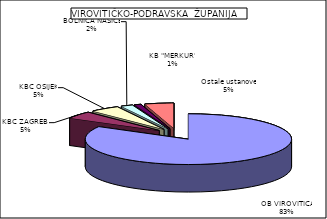
| Category | Series 0 |
|---|---|
| OB VIROVITICA | 83.245 |
| KBC ZAGREB  | 4.649 |
| KBC OSIJEK | 4.633 |
| BOLNICA NAŠICE | 1.854 |
| KB "MERKUR" | 1.074 |
| Ostale ustanove | 4.546 |